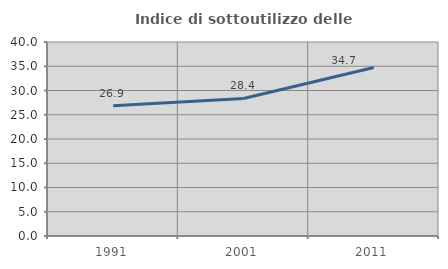
| Category | Indice di sottoutilizzo delle abitazioni  |
|---|---|
| 1991.0 | 26.863 |
| 2001.0 | 28.361 |
| 2011.0 | 34.731 |